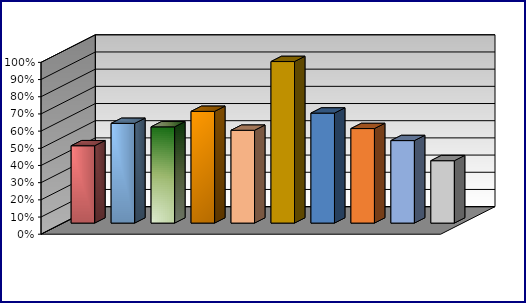
| Category | Series 0 | Series 1 | Series 2 | Series 3 |
|---|---|---|---|---|
| 0 | 0.45 |  |  |  |
| 1 | 0.58 |  |  |  |
| 2 | 0.56 |  |  |  |
| 3 | 0.65 |  |  |  |
| 4 | 0.54 |  |  |  |
| 5 | 0.94 |  |  |  |
| 6 | 0.64 |  |  |  |
| 7 | 0.55 |  |  |  |
| 8 | 0.48 |  |  |  |
| 9 | 0.363 |  |  |  |